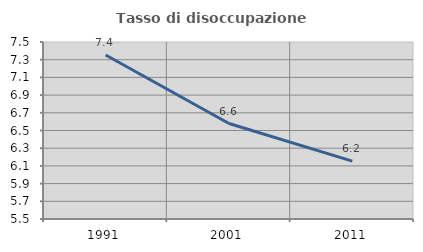
| Category | Tasso di disoccupazione giovanile  |
|---|---|
| 1991.0 | 7.353 |
| 2001.0 | 6.579 |
| 2011.0 | 6.154 |